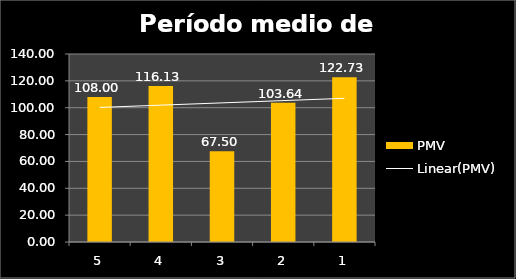
| Category | PMV |
|---|---|
| 5.0 | 108 |
| 4.0 | 116.129 |
| 3.0 | 67.5 |
| 2.0 | 103.636 |
| 1.0 | 122.727 |